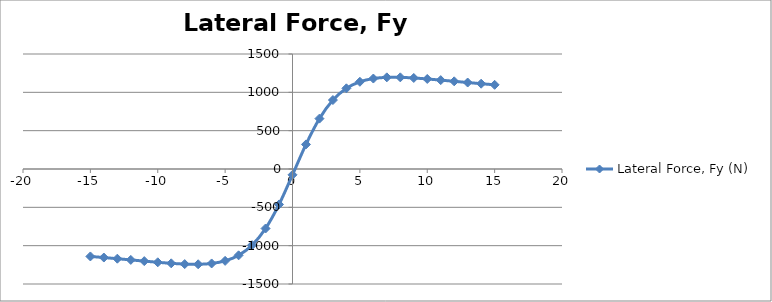
| Category | Lateral Force, Fy (N) |
|---|---|
| -15.0 | -1140.504 |
| -14.0 | -1154.909 |
| -13.0 | -1170.027 |
| -12.0 | -1185.668 |
| -11.0 | -1201.466 |
| -10.0 | -1216.747 |
| -9.0 | -1230.33 |
| -8.0 | -1240.16 |
| -7.0 | -1242.72 |
| -6.0 | -1232.057 |
| -5.0 | -1198.331 |
| -4.0 | -1126.063 |
| -3.0 | -993.394 |
| -2.0 | -776.182 |
| -1.0 | -462.658 |
| 0.0 | -75.994 |
| 1.0 | 320.48 |
| 2.0 | 657.211 |
| 3.0 | 899.504 |
| 4.0 | 1052.094 |
| 5.0 | 1137.821 |
| 6.0 | 1179.868 |
| 7.0 | 1195.414 |
| 8.0 | 1195.61 |
| 9.0 | 1187.263 |
| 10.0 | 1174.418 |
| 11.0 | 1159.438 |
| 12.0 | 1143.695 |
| 13.0 | 1127.968 |
| 14.0 | 1112.689 |
| 15.0 | 1098.086 |